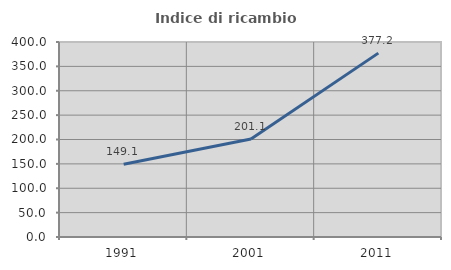
| Category | Indice di ricambio occupazionale  |
|---|---|
| 1991.0 | 149.141 |
| 2001.0 | 201.063 |
| 2011.0 | 377.178 |